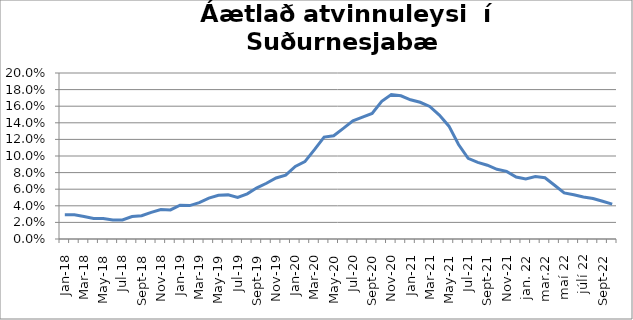
| Category | Series 0 |
|---|---|
| jan.18 | 0.029 |
| feb.18 | 0.029 |
| mar.18 | 0.027 |
| apr.18 | 0.025 |
| maí.18 | 0.025 |
| jún.18 | 0.023 |
| júl.18 | 0.023 |
| ágú.18 | 0.027 |
| sep.18 | 0.028 |
| okt.18 | 0.032 |
| nóv.18 | 0.036 |
| des.18 | 0.035 |
| jan.19 | 0.041 |
| feb.19 | 0.04 |
| mar.19 | 0.044 |
| apr.19 | 0.049 |
| maí.19 | 0.053 |
| jún.19 | 0.053 |
| júl.19 | 0.05 |
| ágú.19 | 0.054 |
| sep.19 | 0.062 |
| okt.19 | 0.067 |
| nóv.19 | 0.073 |
| des.19 | 0.077 |
| jan.20 | 0.087 |
| feb.20 | 0.093 |
| mar.20 | 0.108 |
| apr.20 | 0.123 |
| maí.20 | 0.124 |
| jún.20 | 0.133 |
| júl.20 | 0.142 |
| ágú.20 | 0.147 |
| sep.20 | 0.151 |
| okt.20 | 0.166 |
| nóv.20 | 0.174 |
| des.20 | 0.173 |
| jan.21 | 0.168 |
| feb.21 | 0.165 |
| mar.21 | 0.16 |
| apr.21 | 0.149 |
| maí.21 | 0.136 |
| jún.21 | 0.114 |
| júl.21 | 0.097 |
| ágú.21 | 0.092 |
| sep.21 | 0.089 |
| okt.21 | 0.084 |
| nóv.21 | 0.082 |
| des.21 | 0.075 |
| jan. 22 | 0.072 |
| feb.22 | 0.075 |
| mar.22 | 0.074 |
| apr.22 | 0.065 |
| maí 22 | 0.056 |
| júní 22 | 0.053 |
| júlí 22 | 0.051 |
| ágúst 22 | 0.049 |
| sep.22 | 0.045 |
| okt.22 | 0.042 |